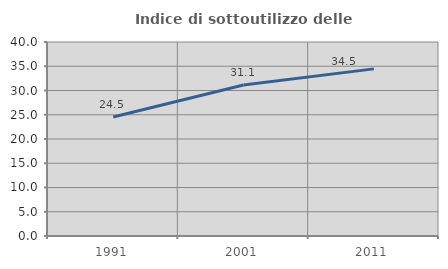
| Category | Indice di sottoutilizzo delle abitazioni  |
|---|---|
| 1991.0 | 24.545 |
| 2001.0 | 31.142 |
| 2011.0 | 34.459 |